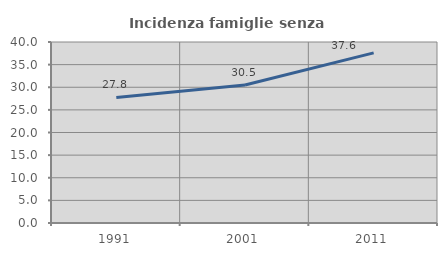
| Category | Incidenza famiglie senza nuclei |
|---|---|
| 1991.0 | 27.758 |
| 2001.0 | 30.503 |
| 2011.0 | 37.6 |